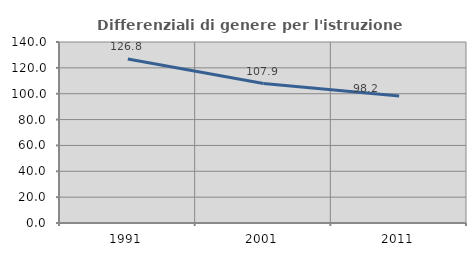
| Category | Differenziali di genere per l'istruzione superiore |
|---|---|
| 1991.0 | 126.821 |
| 2001.0 | 107.882 |
| 2011.0 | 98.246 |